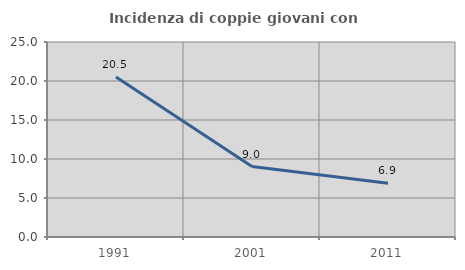
| Category | Incidenza di coppie giovani con figli |
|---|---|
| 1991.0 | 20.52 |
| 2001.0 | 9.034 |
| 2011.0 | 6.897 |